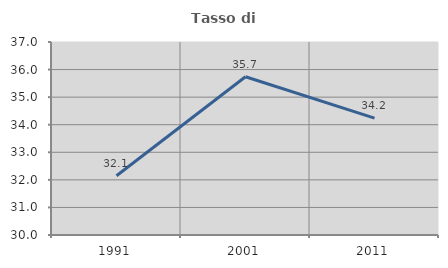
| Category | Tasso di occupazione   |
|---|---|
| 1991.0 | 32.148 |
| 2001.0 | 35.741 |
| 2011.0 | 34.238 |